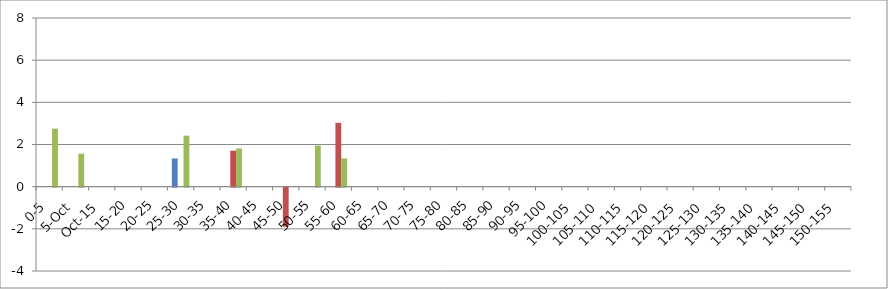
| Category | 119875 | 146067 | 241240 |
|---|---|---|---|
| 0-5 | 0 | 0 | 2.752 |
| 5.Oct | 0 | 0 | 1.562 |
| Oct.15 | 0 | 0 | 0 |
| 15-20 | 0 | 0 | 0 |
| 20-25 | 0 | 0 | 0 |
| 25-30 | 1.338 | 0 | 2.419 |
| 30-35 | 0 | 0 | 0 |
| 35-40 | 0 | 1.708 | 1.813 |
| 40-45 | 0 | 0 | 0 |
| 45-50 | 0 | -1.855 | 0 |
| 50-55 | 0 | 0 | 1.949 |
| 55-60 | 0 | 3.029 | 1.34 |
| 60-65 | 0 | 0 | 0 |
| 65-70 | 0 | 0 | 0 |
| 70-75 | 0 | 0 | 0 |
| 75-80 | 0 | 0 | 0 |
| 80-85 | 0 | 0 | 0 |
| 85-90 | 0 | 0 | 0 |
| 90-95 | 0 | 0 | 0 |
| 95-100 | 0 | 0 | 0 |
| 100-105 | 0 | 0 | 0 |
| 105-110 | 0 | 0 | 0 |
| 110-115 | 0 | 0 | 0 |
| 115-120 | 0 | 0 | 0 |
| 120-125 | 0 | 0 | 0 |
| 125-130 | 0 | 0 | 0 |
| 130-135 | 0 | 0 | 0 |
| 135-140 | 0 | 0 | 0 |
| 140-145 | 0 | 0 | 0 |
| 145-150 | 0 | 0 | 0 |
| 150-155 | 0 | 0 | 0 |